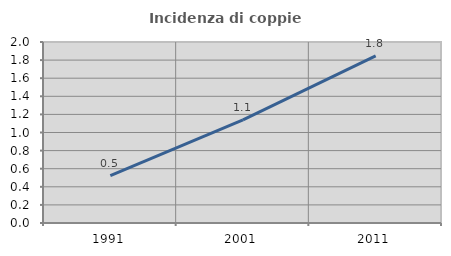
| Category | Incidenza di coppie miste |
|---|---|
| 1991.0 | 0.524 |
| 2001.0 | 1.14 |
| 2011.0 | 1.846 |